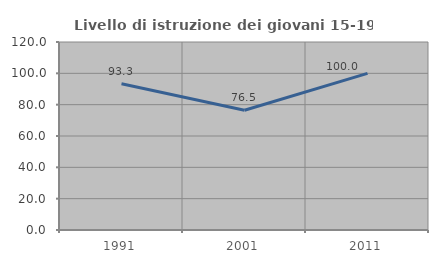
| Category | Livello di istruzione dei giovani 15-19 anni |
|---|---|
| 1991.0 | 93.333 |
| 2001.0 | 76.471 |
| 2011.0 | 100 |